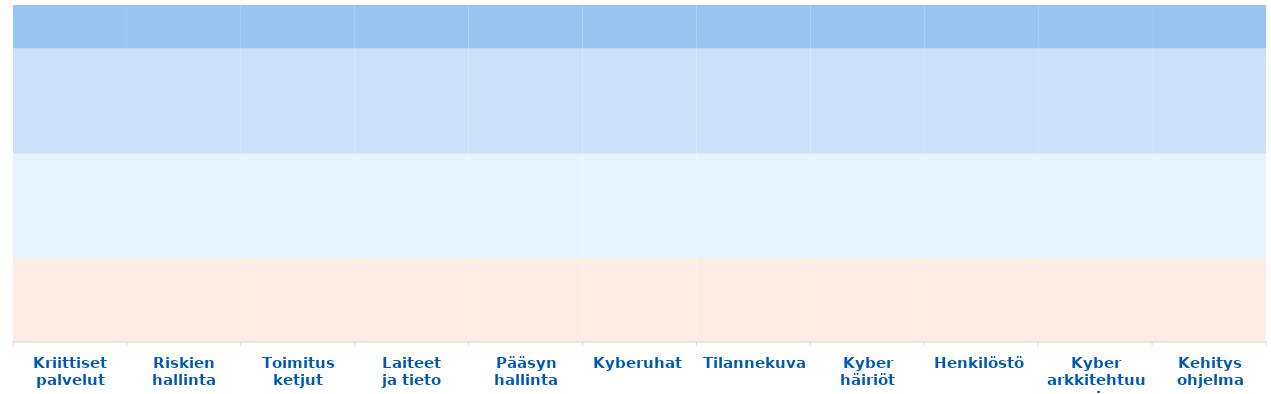
| Category | MIL0 | MIL1 | MIl2 | MIL3 |
|---|---|---|---|---|
| Kriittiset
palvelut | 0.8 | 1 | 1 | 0.5 |
| Riskien
hallinta | 0.8 | 1 | 1 | 0.5 |
| Toimitus
ketjut | 0.8 | 1 | 1 | 0.5 |
| Laiteet
ja tieto | 0.8 | 1 | 1 | 0.5 |
| Pääsyn
hallinta | 0.8 | 1 | 1 | 0.5 |
| Kyberuhat | 0.8 | 1 | 1 | 0.5 |
| Tilannekuva | 0.8 | 1 | 1 | 0.5 |
| Kyber
häiriöt | 0.8 | 1 | 1 | 0.5 |
| Henkilöstö | 0.8 | 1 | 1 | 0.5 |
| Kyber
arkkitehtuuri | 0.8 | 1 | 1 | 0.5 |
| Kehitys
ohjelma | 0.8 | 1 | 1 | 0.5 |